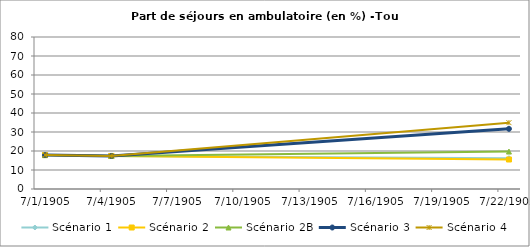
| Category | Scénario 1 | Scénario 2 | Scénario 2B | Scénario 3 | Scénario 4 |
|---|---|---|---|---|---|
| 2009.0 | 17.84 | 17.84 | 17.84 | 17.84 | 17.84 |
| 2012.0 | 17.392 | 17.392 | 17.392 | 17.392 | 17.392 |
| 2030.0 | 16.23 | 15.528 | 19.704 | 31.664 | 34.92 |